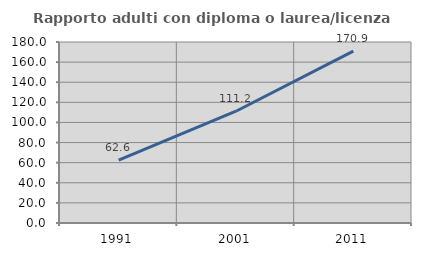
| Category | Rapporto adulti con diploma o laurea/licenza media  |
|---|---|
| 1991.0 | 62.587 |
| 2001.0 | 111.168 |
| 2011.0 | 170.925 |